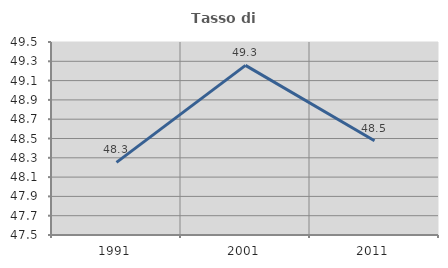
| Category | Tasso di occupazione   |
|---|---|
| 1991.0 | 48.252 |
| 2001.0 | 49.258 |
| 2011.0 | 48.477 |